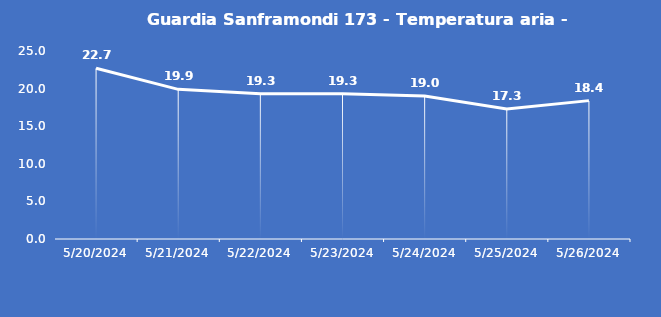
| Category | Guardia Sanframondi 173 - Temperatura aria - Grezzo (°C) |
|---|---|
| 5/20/24 | 22.7 |
| 5/21/24 | 19.9 |
| 5/22/24 | 19.3 |
| 5/23/24 | 19.3 |
| 5/24/24 | 19 |
| 5/25/24 | 17.3 |
| 5/26/24 | 18.4 |